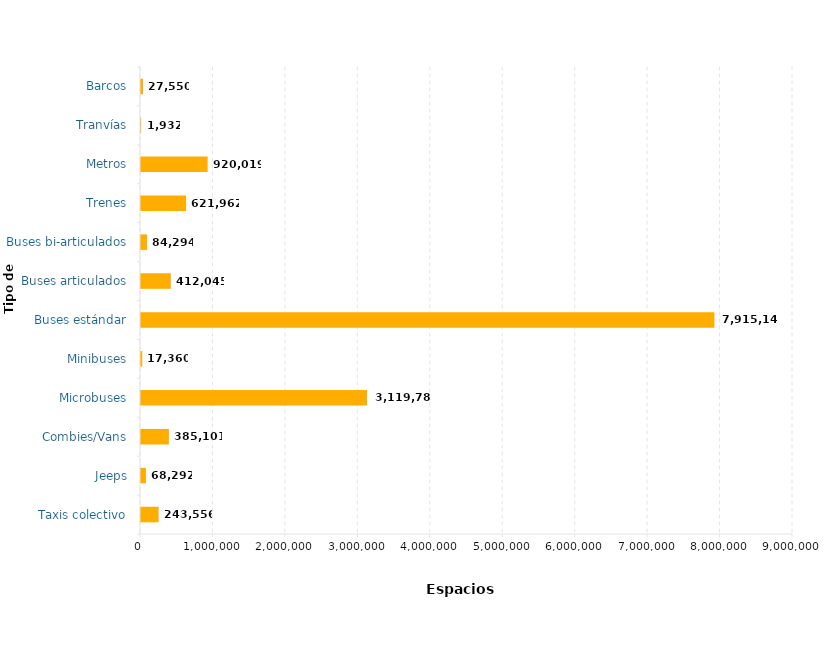
| Category | Espacios disponibles |
|---|---|
| Taxis colectivo | 243556 |
| Jeeps | 68292 |
| Combies/Vans | 385101 |
| Microbuses | 3119785 |
| Minibuses | 17360 |
| Buses estándar | 7915142 |
| Buses articulados | 412045 |
| Buses bi-articulados | 84294 |
| Trenes | 621962 |
| Metros | 920019 |
| Tranvías | 1932 |
| Barcos | 27550 |